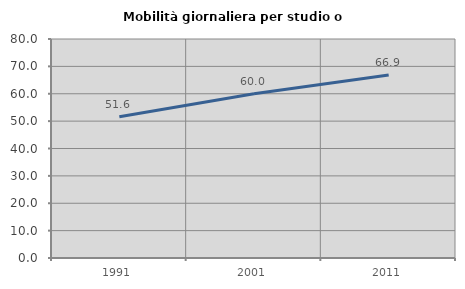
| Category | Mobilità giornaliera per studio o lavoro |
|---|---|
| 1991.0 | 51.579 |
| 2001.0 | 59.977 |
| 2011.0 | 66.85 |